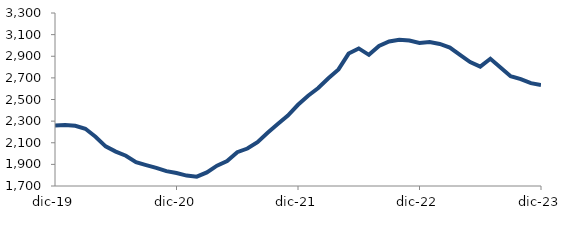
| Category | Series 0 |
|---|---|
| 2019-12-01 | 2259.926 |
| 2020-01-01 | 2265.053 |
| 2020-02-01 | 2256.766 |
| 2020-03-01 | 2229.161 |
| 2020-04-01 | 2155.791 |
| 2020-05-01 | 2066.843 |
| 2020-06-01 | 2018.026 |
| 2020-07-01 | 1979.558 |
| 2020-08-01 | 1920.368 |
| 2020-09-01 | 1893.237 |
| 2020-10-01 | 1867.4 |
| 2020-11-01 | 1837.195 |
| 2020-12-01 | 1819.546 |
| 2021-01-01 | 1796.45 |
| 2021-02-01 | 1786.603 |
| 2021-03-01 | 1826.072 |
| 2021-04-01 | 1887.798 |
| 2021-05-01 | 1930.372 |
| 2021-06-01 | 2012.926 |
| 2021-07-01 | 2046.434 |
| 2021-08-01 | 2105.806 |
| 2021-09-01 | 2192.514 |
| 2021-10-01 | 2272.972 |
| 2021-11-01 | 2351.334 |
| 2021-12-01 | 2451.171 |
| 2022-01-01 | 2534.613 |
| 2022-02-01 | 2606.357 |
| 2022-03-01 | 2696.948 |
| 2022-04-01 | 2778.264 |
| 2022-05-01 | 2924.682 |
| 2022-06-01 | 2972.281 |
| 2022-07-01 | 2912.933 |
| 2022-08-01 | 2994.913 |
| 2022-09-01 | 3036.467 |
| 2022-10-01 | 3052.236 |
| 2022-11-01 | 3044.767 |
| 2022-12-01 | 3023.141 |
| 2023-01-01 | 3030.956 |
| 2023-02-01 | 3013.674 |
| 2023-03-01 | 2979.861 |
| 2023-04-01 | 2913.014 |
| 2023-05-01 | 2845.832 |
| 2023-06-01 | 2803.594 |
| 2023-07-01 | 2876.7 |
| 2023-08-01 | 2796.297 |
| 2023-09-01 | 2715.691 |
| 2023-10-01 | 2689.066 |
| 2023-11-01 | 2650.837 |
| 2023-12-01 | 2633.487 |